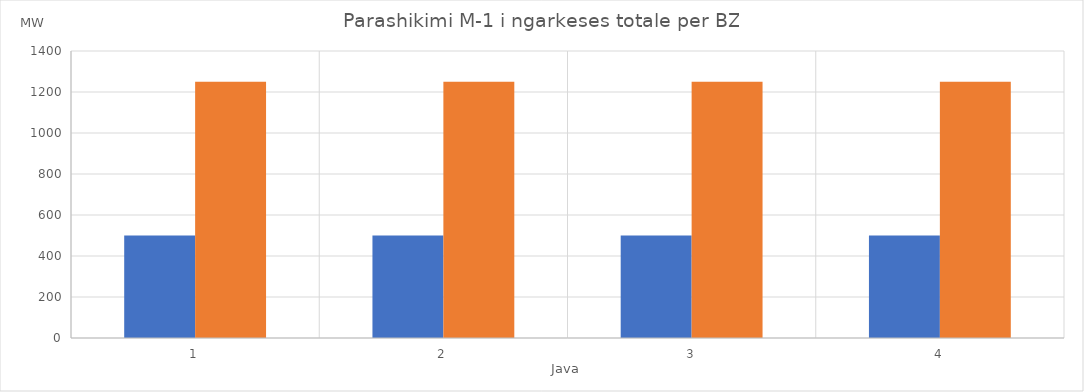
| Category | Min (MW) | Max (MW) |
|---|---|---|
| 0 | 500 | 1250 |
| 1 | 500 | 1250 |
| 2 | 500 | 1250 |
| 3 | 500 | 1250 |